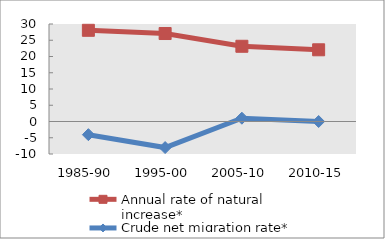
| Category | Annual rate of natural increase* | Crude net migration rate* |
|---|---|---|
| 1985-90 | 28.058 | -4.05 |
| 1995-00 | 27.07 | -8.024 |
| 2005-10 | 23.146 | 1.019 |
| 2010-15 | 22.063 | 0 |